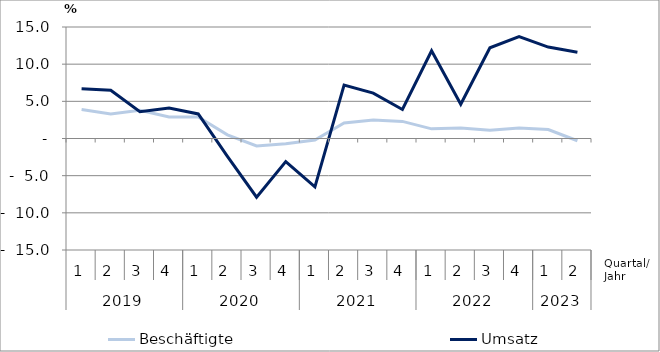
| Category | Beschäftigte | Umsatz |
|---|---|---|
| 0 | 3.9 | 6.7 |
| 1 | 3.3 | 6.5 |
| 2 | 3.8 | 3.6 |
| 3 | 2.9 | 4.1 |
| 4 | 2.9 | 3.3 |
| 5 | 0.5 | -2.4 |
| 6 | -1 | -7.9 |
| 7 | -0.7 | -3.1 |
| 8 | -0.2 | -6.5 |
| 9 | 2.1 | 7.2 |
| 10 | 2.5 | 6.1 |
| 11 | 2.3 | 3.9 |
| 12 | 1.3 | 11.8 |
| 13 | 1.4 | 4.6 |
| 14 | 1.1 | 12.2 |
| 15 | 1.4 | 13.7 |
| 16 | 1.2 | 12.3 |
| 17 | -0.3 | 11.6 |